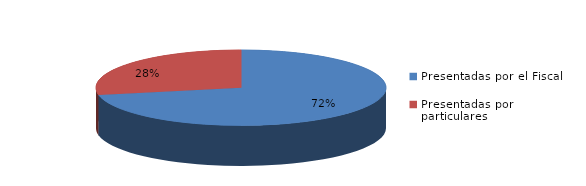
| Category | Series 0 |
|---|---|
| Presentadas por el Fiscal | 351 |
| Presentadas por particulares | 137 |